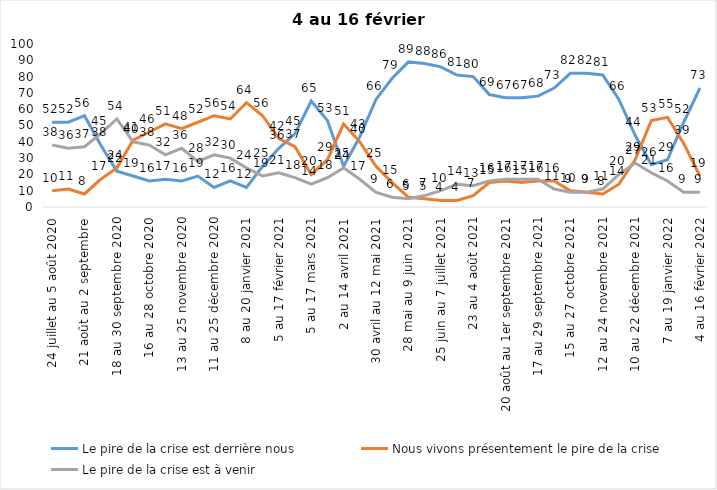
| Category | Le pire de la crise est derrière nous | Nous vivons présentement le pire de la crise | Le pire de la crise est à venir |
|---|---|---|---|
| 24 juillet au 5 août 2020 | 52 | 10 | 38 |
| 7 au 19 août 2020 | 52 | 11 | 36 |
| 21 août au 2 septembre | 56 | 8 | 37 |
| 4 au 16 septembre 2020 | 38 | 17 | 45 |
| 18 au 30 septembre 2020 | 22 | 24 | 54 |
| 2 au 14 octobre 2020 | 19 | 41 | 40 |
| 16 au 28 octobre 2020 | 16 | 46 | 38 |
| 30 octobre au 11 novembre 2020 | 17 | 51 | 32 |
| 13 au 25 novembre 2020 | 16 | 48 | 36 |
| 27 au 9 décembre 2020 | 19 | 52 | 28 |
| 11 au 25 décembre 2020 | 12 | 56 | 32 |
| 25 décembre 2020 au 6 janvier 2021 | 16 | 54 | 30 |
| 8 au 20 janvier 2021 | 12 | 64 | 24 |
| 22 janvier au 3 février 2021 | 25 | 56 | 19 |
| 5 au 17 février 2021 | 36 | 42 | 21 |
| 19 février au 3 mars 2021 | 45 | 37 | 18 |
| 5 au 17 mars 2021 | 65 | 20 | 14 |
| 19 au 31 mars 2021 | 53 | 29 | 18 |
| 2 au 14 avril 2021 | 25 | 51 | 24 |
| 16 au 28 avril 2021 | 43 | 40 | 17 |
| 30 avril au 12 mai 2021 | 66 | 25 | 9 |
| 14 au 26 mai 2021 | 79 | 15 | 6 |
| 28 mai au 9 juin 2021 | 89 | 6 | 5 |
| 11 au 23 juin 2021 | 88 | 5 | 7 |
| 25 juin au 7 juillet 2021 | 86 | 4 | 10 |
| 9 au 21 juillet 2021 | 81 | 4 | 14 |
| 23 au 4 août 2021 | 80 | 7 | 13 |
| 6 au 18 août 2021 | 69 | 15 | 16 |
| 20 août au 1er septembre 2021 | 67 | 16 | 17 |
| 3 au 15 septembre 2021 | 67 | 15 | 17 |
| 17 au 29 septembre 2021 | 68 | 16 | 17 |
| 1 au 13 octobre 2021 | 73 | 16 | 11 |
| 15 au 27 octobre 2021 | 82 | 10 | 9 |
| 29 octobre au 10 novembre 2021 | 82 | 9 | 9 |
| 12 au 24 novembre 2021 | 81 | 8 | 11 |
| 26 novembre au 8 décembre 2021 | 66 | 14 | 20 |
| 10 au 22 décembre 2021 | 44 | 29 | 27 |
| 24 décembre 2021 au 5 janvier 2022 | 26 | 53 | 21 |
| 7 au 19 janvier 2022 | 29 | 55 | 16 |
| 21 janvier au 2 février 2022 | 52 | 39 | 9 |
| 4 au 16 février 2022 | 73 | 19 | 9 |